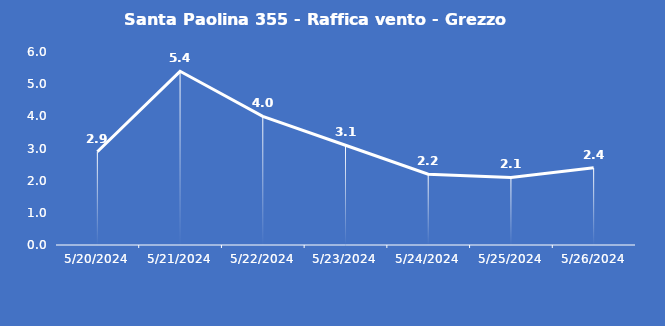
| Category | Santa Paolina 355 - Raffica vento - Grezzo (m/s) |
|---|---|
| 5/20/24 | 2.9 |
| 5/21/24 | 5.4 |
| 5/22/24 | 4 |
| 5/23/24 | 3.1 |
| 5/24/24 | 2.2 |
| 5/25/24 | 2.1 |
| 5/26/24 | 2.4 |